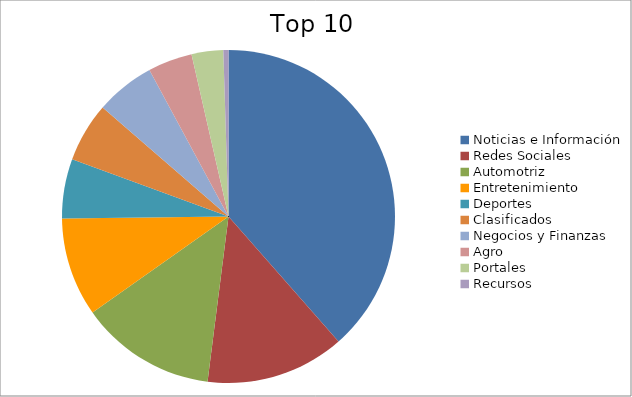
| Category | Series 0 |
|---|---|
| Noticias e Información | 37.89 |
| Redes Sociales | 13.28 |
| Automotriz | 12.98 |
| Entretenimiento | 9.44 |
| Deportes | 5.69 |
| Clasificados | 5.68 |
| Negocios y Finanzas | 5.67 |
| Agro | 4.24 |
| Portales | 3.02 |
| Recursos | 0.49 |